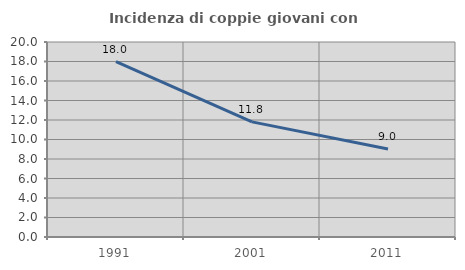
| Category | Incidenza di coppie giovani con figli |
|---|---|
| 1991.0 | 17.996 |
| 2001.0 | 11.807 |
| 2011.0 | 9.028 |